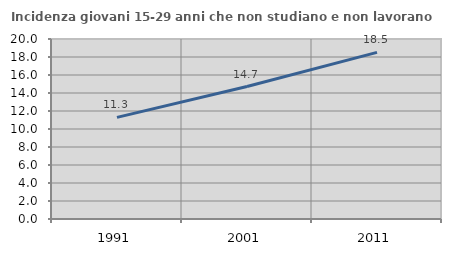
| Category | Incidenza giovani 15-29 anni che non studiano e non lavorano  |
|---|---|
| 1991.0 | 11.291 |
| 2001.0 | 14.719 |
| 2011.0 | 18.517 |